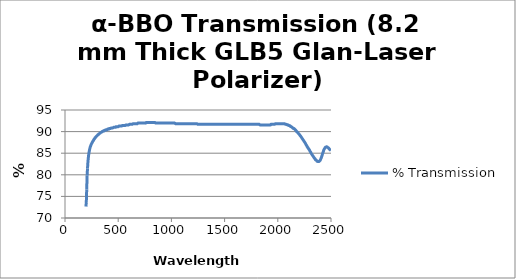
| Category | % Transmission |
|---|---|
| 196.634 | 72.651 |
| 200.359 | 73.694 |
| 204.084 | 76.612 |
| 207.81 | 79.809 |
| 211.535 | 81.477 |
| 215.26 | 82.867 |
| 218.986 | 83.84 |
| 222.711 | 84.674 |
| 226.436 | 85.23 |
| 230.162 | 85.716 |
| 233.887 | 86.133 |
| 237.612 | 86.48 |
| 241.338 | 86.689 |
| 245.063 | 86.967 |
| 248.788 | 87.176 |
| 252.514 | 87.314 |
| 256.239 | 87.523 |
| 259.964 | 87.662 |
| 263.69 | 87.87 |
| 267.415 | 87.94 |
| 271.14 | 88.148 |
| 274.866 | 88.287 |
| 278.591 | 88.357 |
| 282.317 | 88.565 |
| 286.042 | 88.635 |
| 289.767 | 88.774 |
| 293.493 | 88.843 |
| 297.218 | 88.982 |
| 300.943 | 89.052 |
| 304.669 | 89.121 |
| 308.394 | 89.26 |
| 312.119 | 89.26 |
| 315.845 | 89.399 |
| 319.57 | 89.469 |
| 323.295 | 89.538 |
| 327.021 | 89.608 |
| 330.746 | 89.677 |
| 334.471 | 89.747 |
| 338.197 | 89.816 |
| 341.922 | 89.886 |
| 345.647 | 89.886 |
| 349.373 | 90.025 |
| 353.098 | 90.025 |
| 356.823 | 90.094 |
| 360.549 | 90.164 |
| 364.274 | 90.164 |
| 367.999 | 90.164 |
| 371.725 | 90.303 |
| 375.45 | 90.303 |
| 379.176 | 90.303 |
| 382.901 | 90.303 |
| 386.626 | 90.442 |
| 390.352 | 90.442 |
| 394.077 | 90.442 |
| 397.802 | 90.442 |
| 401.528 | 90.581 |
| 405.253 | 90.581 |
| 408.978 | 90.581 |
| 412.704 | 90.581 |
| 416.429 | 90.72 |
| 420.154 | 90.72 |
| 423.88 | 90.72 |
| 427.605 | 90.72 |
| 431.33 | 90.789 |
| 435.056 | 90.859 |
| 438.781 | 90.859 |
| 442.506 | 90.859 |
| 446.232 | 90.859 |
| 449.957 | 90.859 |
| 453.682 | 90.928 |
| 457.408 | 90.998 |
| 461.133 | 90.998 |
| 464.858 | 90.998 |
| 468.584 | 90.998 |
| 472.309 | 90.998 |
| 476.035 | 90.998 |
| 479.76 | 91.137 |
| 483.485 | 91.137 |
| 487.211 | 91.137 |
| 490.936 | 91.137 |
| 494.661 | 91.137 |
| 498.387 | 91.137 |
| 502.112 | 91.137 |
| 505.837 | 91.276 |
| 509.563 | 91.276 |
| 513.288 | 91.276 |
| 517.013 | 91.276 |
| 520.739 | 91.276 |
| 524.464 | 91.276 |
| 528.189 | 91.276 |
| 531.915 | 91.276 |
| 535.64 | 91.345 |
| 539.365 | 91.415 |
| 543.091 | 91.415 |
| 546.816 | 91.415 |
| 550.541 | 91.415 |
| 554.267 | 91.415 |
| 557.992 | 91.415 |
| 561.717 | 91.415 |
| 565.443 | 91.415 |
| 569.168 | 91.484 |
| 572.894 | 91.554 |
| 576.619 | 91.554 |
| 580.344 | 91.554 |
| 584.07 | 91.554 |
| 587.795 | 91.554 |
| 591.52 | 91.554 |
| 595.246 | 91.554 |
| 598.971 | 91.554 |
| 602.696 | 91.623 |
| 606.422 | 91.692 |
| 610.147 | 91.692 |
| 613.872 | 91.692 |
| 617.598 | 91.692 |
| 621.323 | 91.692 |
| 625.048 | 91.692 |
| 628.774 | 91.692 |
| 632.499 | 91.692 |
| 636.224 | 91.762 |
| 639.95 | 91.832 |
| 643.675 | 91.832 |
| 647.4 | 91.832 |
| 651.126 | 91.832 |
| 654.851 | 91.832 |
| 658.576 | 91.832 |
| 662.302 | 91.832 |
| 666.027 | 91.832 |
| 669.753 | 91.832 |
| 673.478 | 91.832 |
| 677.203 | 91.832 |
| 680.929 | 91.832 |
| 684.654 | 91.97 |
| 688.379 | 91.97 |
| 692.105 | 91.97 |
| 695.83 | 91.97 |
| 699.555 | 91.97 |
| 703.281 | 91.97 |
| 707.006 | 91.97 |
| 710.731 | 91.97 |
| 714.457 | 91.97 |
| 718.182 | 91.97 |
| 721.907 | 91.97 |
| 725.633 | 91.97 |
| 729.358 | 91.97 |
| 733.083 | 91.97 |
| 736.809 | 91.97 |
| 740.534 | 91.97 |
| 744.259 | 91.97 |
| 747.985 | 91.97 |
| 751.71 | 91.97 |
| 755.435 | 91.97 |
| 759.161 | 91.97 |
| 762.886 | 92.11 |
| 766.612 | 92.11 |
| 770.337 | 92.11 |
| 774.062 | 92.11 |
| 777.788 | 92.11 |
| 781.513 | 92.11 |
| 785.238 | 92.11 |
| 788.964 | 92.11 |
| 792.689 | 92.11 |
| 796.414 | 92.11 |
| 800.14 | 92.11 |
| 803.865 | 92.11 |
| 807.59 | 92.11 |
| 811.316 | 92.11 |
| 815.041 | 92.11 |
| 818.766 | 92.11 |
| 822.492 | 92.11 |
| 826.217 | 92.11 |
| 829.942 | 92.11 |
| 833.668 | 92.11 |
| 837.393 | 92.11 |
| 841.118 | 92.11 |
| 844.844 | 92.11 |
| 848.569 | 92.04 |
| 852.294 | 91.97 |
| 856.02 | 91.97 |
| 859.745 | 91.97 |
| 863.471 | 91.97 |
| 867.196 | 91.97 |
| 870.921 | 91.97 |
| 874.647 | 91.97 |
| 878.372 | 91.97 |
| 882.097 | 91.97 |
| 885.823 | 91.97 |
| 889.548 | 91.97 |
| 893.273 | 91.97 |
| 896.999 | 91.97 |
| 900.724 | 91.97 |
| 904.449 | 91.97 |
| 908.175 | 91.97 |
| 911.9 | 91.97 |
| 915.625 | 91.97 |
| 919.351 | 91.97 |
| 923.076 | 91.97 |
| 926.801 | 91.97 |
| 930.527 | 91.97 |
| 934.252 | 91.97 |
| 937.977 | 91.97 |
| 941.703 | 91.97 |
| 945.428 | 91.97 |
| 949.153 | 91.97 |
| 952.879 | 91.97 |
| 956.604 | 91.97 |
| 960.33 | 91.97 |
| 964.055 | 91.97 |
| 967.78 | 91.97 |
| 971.506 | 91.97 |
| 975.231 | 91.97 |
| 978.956 | 91.97 |
| 982.682 | 91.97 |
| 986.407 | 91.97 |
| 990.132 | 91.97 |
| 993.858 | 91.97 |
| 997.583 | 91.97 |
| 1001.31 | 91.97 |
| 1005.03 | 91.97 |
| 1008.76 | 91.97 |
| 1012.48 | 91.97 |
| 1016.21 | 91.97 |
| 1019.94 | 91.97 |
| 1023.66 | 91.97 |
| 1027.39 | 91.97 |
| 1031.11 | 91.97 |
| 1034.84 | 91.901 |
| 1038.56 | 91.832 |
| 1042.29 | 91.832 |
| 1046.01 | 91.832 |
| 1049.74 | 91.832 |
| 1053.46 | 91.832 |
| 1057.19 | 91.832 |
| 1060.91 | 91.832 |
| 1064.64 | 91.832 |
| 1068.36 | 91.832 |
| 1072.09 | 91.832 |
| 1075.82 | 91.832 |
| 1079.54 | 91.832 |
| 1083.27 | 91.832 |
| 1086.99 | 91.832 |
| 1090.72 | 91.832 |
| 1094.44 | 91.832 |
| 1098.17 | 91.832 |
| 1101.89 | 91.832 |
| 1105.62 | 91.832 |
| 1109.34 | 91.832 |
| 1113.07 | 91.832 |
| 1116.79 | 91.832 |
| 1120.52 | 91.832 |
| 1124.24 | 91.832 |
| 1127.97 | 91.832 |
| 1131.7 | 91.832 |
| 1135.42 | 91.832 |
| 1139.15 | 91.832 |
| 1142.87 | 91.832 |
| 1146.6 | 91.832 |
| 1150.32 | 91.832 |
| 1154.05 | 91.832 |
| 1157.77 | 91.832 |
| 1161.5 | 91.832 |
| 1165.22 | 91.832 |
| 1168.95 | 91.832 |
| 1172.67 | 91.832 |
| 1176.4 | 91.832 |
| 1180.12 | 91.832 |
| 1183.85 | 91.832 |
| 1187.58 | 91.832 |
| 1191.3 | 91.832 |
| 1195.03 | 91.832 |
| 1198.75 | 91.832 |
| 1202.48 | 91.832 |
| 1206.2 | 91.832 |
| 1209.93 | 91.832 |
| 1213.65 | 91.832 |
| 1217.38 | 91.832 |
| 1221.1 | 91.832 |
| 1224.83 | 91.832 |
| 1228.55 | 91.832 |
| 1232.28 | 91.832 |
| 1236.01 | 91.832 |
| 1239.73 | 91.832 |
| 1243.46 | 91.762 |
| 1247.18 | 91.692 |
| 1250.91 | 91.692 |
| 1254.63 | 91.692 |
| 1258.36 | 91.692 |
| 1262.08 | 91.692 |
| 1265.81 | 91.692 |
| 1269.53 | 91.692 |
| 1273.26 | 91.692 |
| 1276.98 | 91.692 |
| 1280.71 | 91.692 |
| 1284.43 | 91.692 |
| 1288.16 | 91.692 |
| 1291.89 | 91.692 |
| 1295.61 | 91.692 |
| 1299.34 | 91.692 |
| 1303.06 | 91.692 |
| 1306.79 | 91.692 |
| 1310.51 | 91.692 |
| 1314.24 | 91.692 |
| 1317.96 | 91.692 |
| 1321.69 | 91.692 |
| 1325.41 | 91.692 |
| 1329.14 | 91.692 |
| 1332.86 | 91.692 |
| 1336.59 | 91.692 |
| 1340.31 | 91.692 |
| 1344.04 | 91.692 |
| 1347.77 | 91.692 |
| 1351.49 | 91.692 |
| 1355.22 | 91.692 |
| 1358.94 | 91.692 |
| 1362.67 | 91.692 |
| 1366.39 | 91.692 |
| 1370.12 | 91.692 |
| 1373.84 | 91.692 |
| 1377.57 | 91.692 |
| 1381.29 | 91.692 |
| 1385.02 | 91.692 |
| 1388.74 | 91.692 |
| 1392.47 | 91.692 |
| 1396.2 | 91.692 |
| 1399.92 | 91.692 |
| 1403.65 | 91.692 |
| 1407.37 | 91.692 |
| 1411.1 | 91.692 |
| 1414.82 | 91.692 |
| 1418.55 | 91.692 |
| 1422.27 | 91.692 |
| 1426.0 | 91.692 |
| 1429.72 | 91.692 |
| 1433.45 | 91.692 |
| 1437.17 | 91.692 |
| 1440.9 | 91.692 |
| 1444.62 | 91.692 |
| 1448.35 | 91.692 |
| 1452.08 | 91.692 |
| 1455.8 | 91.692 |
| 1459.53 | 91.692 |
| 1463.25 | 91.692 |
| 1466.98 | 91.692 |
| 1470.7 | 91.692 |
| 1474.43 | 91.692 |
| 1478.15 | 91.692 |
| 1481.88 | 91.692 |
| 1485.6 | 91.692 |
| 1489.33 | 91.692 |
| 1493.05 | 91.692 |
| 1496.78 | 91.692 |
| 1500.5 | 91.692 |
| 1504.23 | 91.692 |
| 1507.96 | 91.692 |
| 1511.68 | 91.692 |
| 1515.41 | 91.692 |
| 1519.13 | 91.692 |
| 1522.86 | 91.692 |
| 1526.58 | 91.692 |
| 1530.31 | 91.692 |
| 1534.03 | 91.692 |
| 1537.76 | 91.692 |
| 1541.48 | 91.692 |
| 1545.21 | 91.692 |
| 1548.93 | 91.692 |
| 1552.66 | 91.692 |
| 1556.38 | 91.692 |
| 1560.11 | 91.692 |
| 1563.84 | 91.692 |
| 1567.56 | 91.692 |
| 1571.29 | 91.692 |
| 1575.01 | 91.692 |
| 1578.74 | 91.692 |
| 1582.46 | 91.692 |
| 1586.19 | 91.692 |
| 1589.91 | 91.692 |
| 1593.64 | 91.692 |
| 1597.36 | 91.692 |
| 1601.09 | 91.692 |
| 1604.81 | 91.692 |
| 1608.54 | 91.692 |
| 1612.27 | 91.692 |
| 1615.99 | 91.692 |
| 1619.72 | 91.692 |
| 1623.44 | 91.692 |
| 1627.17 | 91.692 |
| 1630.89 | 91.692 |
| 1634.62 | 91.692 |
| 1638.34 | 91.692 |
| 1642.07 | 91.692 |
| 1645.79 | 91.692 |
| 1649.52 | 91.692 |
| 1653.24 | 91.692 |
| 1656.97 | 91.692 |
| 1660.69 | 91.692 |
| 1664.42 | 91.692 |
| 1668.15 | 91.692 |
| 1671.87 | 91.692 |
| 1675.6 | 91.692 |
| 1679.32 | 91.692 |
| 1683.05 | 91.692 |
| 1686.77 | 91.692 |
| 1690.5 | 91.692 |
| 1694.22 | 91.692 |
| 1697.95 | 91.692 |
| 1701.67 | 91.692 |
| 1705.4 | 91.692 |
| 1709.12 | 91.692 |
| 1712.85 | 91.692 |
| 1716.57 | 91.692 |
| 1720.3 | 91.692 |
| 1724.03 | 91.692 |
| 1727.75 | 91.692 |
| 1731.48 | 91.692 |
| 1735.2 | 91.692 |
| 1738.93 | 91.692 |
| 1742.65 | 91.692 |
| 1746.38 | 91.692 |
| 1750.1 | 91.692 |
| 1753.83 | 91.692 |
| 1757.55 | 91.692 |
| 1761.28 | 91.692 |
| 1765.0 | 91.692 |
| 1768.73 | 91.692 |
| 1772.46 | 91.692 |
| 1776.18 | 91.692 |
| 1779.91 | 91.692 |
| 1783.63 | 91.692 |
| 1787.36 | 91.692 |
| 1791.08 | 91.692 |
| 1794.81 | 91.692 |
| 1798.53 | 91.692 |
| 1802.26 | 91.692 |
| 1805.98 | 91.692 |
| 1809.71 | 91.692 |
| 1813.43 | 91.692 |
| 1817.16 | 91.692 |
| 1820.88 | 91.692 |
| 1824.61 | 91.692 |
| 1828.34 | 91.623 |
| 1832.06 | 91.554 |
| 1835.79 | 91.554 |
| 1839.51 | 91.554 |
| 1843.24 | 91.554 |
| 1846.96 | 91.554 |
| 1850.69 | 91.554 |
| 1854.41 | 91.554 |
| 1858.14 | 91.554 |
| 1861.86 | 91.554 |
| 1865.59 | 91.554 |
| 1869.31 | 91.554 |
| 1873.04 | 91.554 |
| 1876.76 | 91.554 |
| 1880.49 | 91.554 |
| 1884.22 | 91.554 |
| 1887.94 | 91.554 |
| 1891.67 | 91.554 |
| 1895.39 | 91.554 |
| 1899.12 | 91.554 |
| 1902.84 | 91.554 |
| 1906.57 | 91.554 |
| 1910.29 | 91.554 |
| 1914.02 | 91.554 |
| 1917.74 | 91.554 |
| 1921.47 | 91.554 |
| 1925.19 | 91.554 |
| 1928.92 | 91.554 |
| 1932.64 | 91.554 |
| 1936.37 | 91.692 |
| 1940.1 | 91.692 |
| 1943.82 | 91.692 |
| 1947.55 | 91.692 |
| 1951.27 | 91.692 |
| 1955.0 | 91.692 |
| 1958.72 | 91.692 |
| 1962.45 | 91.692 |
| 1966.17 | 91.692 |
| 1969.9 | 91.692 |
| 1973.62 | 91.762 |
| 1977.35 | 91.832 |
| 1981.07 | 91.832 |
| 1984.8 | 91.832 |
| 1988.53 | 91.832 |
| 1992.25 | 91.832 |
| 1995.98 | 91.832 |
| 1999.7 | 91.832 |
| 2003.43 | 91.832 |
| 2007.15 | 91.832 |
| 2010.88 | 91.832 |
| 2014.6 | 91.832 |
| 2018.33 | 91.832 |
| 2022.05 | 91.832 |
| 2025.78 | 91.832 |
| 2029.5 | 91.832 |
| 2033.23 | 91.832 |
| 2036.95 | 91.832 |
| 2040.68 | 91.832 |
| 2044.41 | 91.832 |
| 2048.13 | 91.832 |
| 2051.86 | 91.832 |
| 2055.58 | 91.832 |
| 2059.31 | 91.832 |
| 2063.03 | 91.832 |
| 2066.76 | 91.762 |
| 2070.48 | 91.692 |
| 2074.21 | 91.692 |
| 2077.93 | 91.692 |
| 2081.66 | 91.623 |
| 2085.38 | 91.623 |
| 2089.11 | 91.554 |
| 2092.83 | 91.554 |
| 2096.56 | 91.554 |
| 2100.29 | 91.484 |
| 2104.01 | 91.415 |
| 2107.74 | 91.415 |
| 2111.46 | 91.345 |
| 2115.19 | 91.345 |
| 2118.91 | 91.206 |
| 2122.64 | 91.137 |
| 2126.36 | 91.137 |
| 2130.09 | 91.067 |
| 2133.81 | 90.998 |
| 2137.54 | 90.928 |
| 2141.26 | 90.789 |
| 2144.99 | 90.789 |
| 2148.71 | 90.72 |
| 2152.44 | 90.72 |
| 2156.17 | 90.65 |
| 2159.89 | 90.511 |
| 2163.62 | 90.442 |
| 2167.34 | 90.303 |
| 2171.07 | 90.233 |
| 2174.79 | 90.094 |
| 2178.52 | 89.955 |
| 2182.24 | 89.955 |
| 2185.97 | 89.816 |
| 2189.69 | 89.677 |
| 2193.42 | 89.608 |
| 2197.14 | 89.469 |
| 2200.87 | 89.399 |
| 2204.6 | 89.26 |
| 2208.32 | 89.121 |
| 2212.05 | 89.052 |
| 2215.77 | 88.913 |
| 2219.5 | 88.774 |
| 2223.22 | 88.635 |
| 2226.95 | 88.496 |
| 2230.67 | 88.357 |
| 2234.4 | 88.218 |
| 2238.12 | 88.079 |
| 2241.85 | 87.94 |
| 2245.57 | 87.801 |
| 2249.3 | 87.662 |
| 2253.02 | 87.523 |
| 2256.75 | 87.384 |
| 2260.48 | 87.245 |
| 2264.2 | 87.036 |
| 2267.93 | 86.898 |
| 2271.65 | 86.758 |
| 2275.38 | 86.55 |
| 2279.1 | 86.411 |
| 2282.83 | 86.272 |
| 2286.55 | 86.133 |
| 2290.28 | 85.994 |
| 2294.0 | 85.855 |
| 2297.73 | 85.716 |
| 2301.45 | 85.508 |
| 2305.18 | 85.369 |
| 2308.9 | 85.23 |
| 2312.63 | 85.021 |
| 2316.36 | 84.882 |
| 2320.08 | 84.743 |
| 2323.81 | 84.604 |
| 2327.53 | 84.465 |
| 2331.26 | 84.326 |
| 2334.98 | 84.187 |
| 2338.71 | 84.048 |
| 2342.43 | 83.909 |
| 2346.16 | 83.77 |
| 2349.88 | 83.701 |
| 2353.61 | 83.492 |
| 2357.33 | 83.492 |
| 2361.06 | 83.353 |
| 2364.79 | 83.284 |
| 2368.51 | 83.145 |
| 2372.24 | 83.145 |
| 2375.96 | 83.075 |
| 2379.69 | 83.075 |
| 2383.41 | 83.075 |
| 2387.14 | 83.075 |
| 2390.86 | 83.145 |
| 2394.59 | 83.284 |
| 2398.31 | 83.353 |
| 2402.04 | 83.562 |
| 2405.76 | 83.77 |
| 2409.49 | 83.979 |
| 2413.21 | 84.257 |
| 2416.94 | 84.535 |
| 2420.67 | 84.882 |
| 2424.39 | 85.16 |
| 2428.12 | 85.369 |
| 2431.84 | 85.716 |
| 2435.57 | 85.925 |
| 2439.29 | 86.064 |
| 2443.02 | 86.203 |
| 2446.74 | 86.342 |
| 2450.47 | 86.411 |
| 2454.19 | 86.411 |
| 2457.92 | 86.48 |
| 2461.64 | 86.48 |
| 2465.37 | 86.411 |
| 2469.09 | 86.342 |
| 2472.82 | 86.272 |
| 2476.55 | 86.203 |
| 2480.27 | 86.064 |
| 2484.0 | 85.994 |
| 2487.72 | 85.855 |
| 2491.45 | 85.786 |
| 2495.17 | 85.716 |
| 2498.9 | 85.647 |